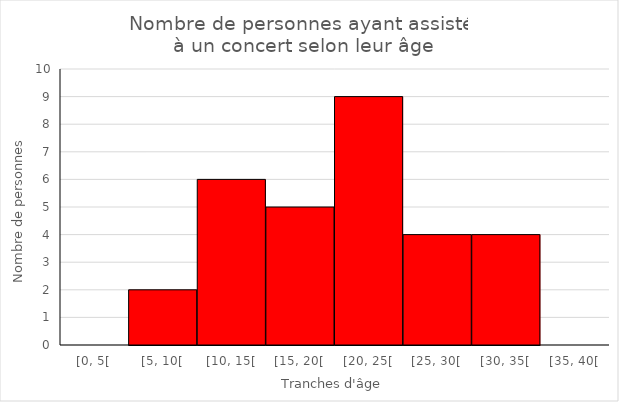
| Category | Series 0 |
|---|---|
| [0, 5[ | 0 |
| [5, 10[ | 2 |
| [10, 15[ | 6 |
| [15, 20[ | 5 |
| [20, 25[ | 9 |
| [25, 30[ | 4 |
| [30, 35[ | 4 |
| [35, 40[ | 0 |